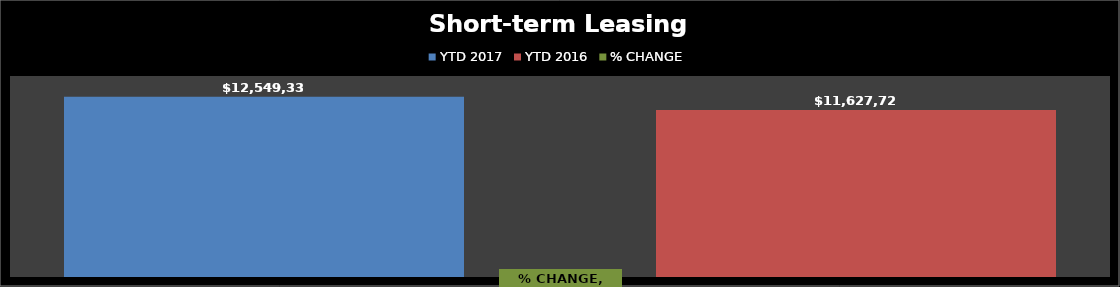
| Category | YTD 2017 | YTD 2016 |
|---|---|---|
| 0 | 12549338.34 | 11627723.68 |